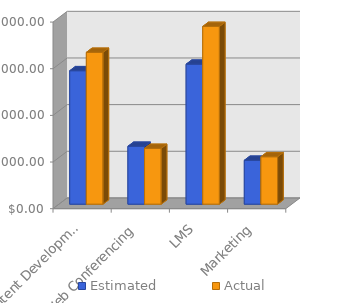
| Category | Estimated | Actual |
|---|---|---|
| Content Development | 14300 | 16270 |
| Web Conferencing | 6200 | 5976 |
| LMS | 15000 | 19048 |
| Marketing | 4700 | 5081 |